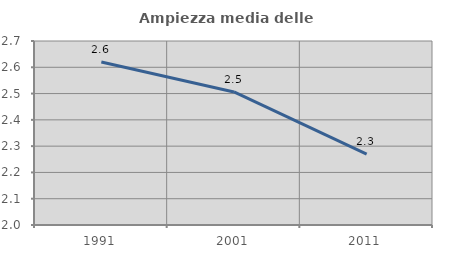
| Category | Ampiezza media delle famiglie |
|---|---|
| 1991.0 | 2.62 |
| 2001.0 | 2.506 |
| 2011.0 | 2.27 |